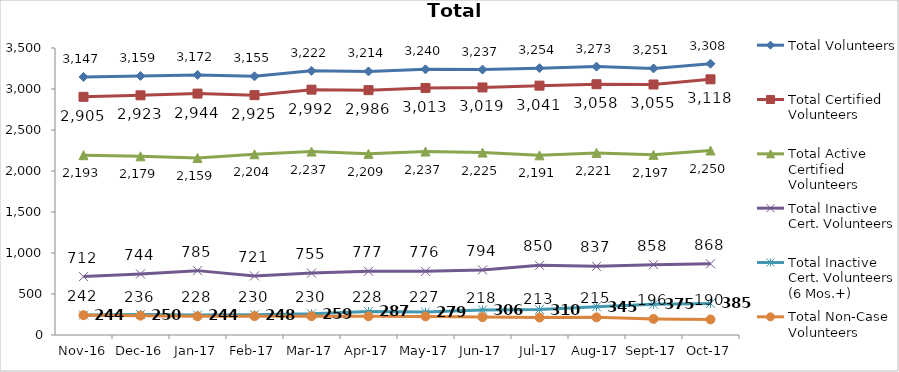
| Category | Total Volunteers | Total Certified Volunteers | Total Active Certified Volunteers | Total Inactive Cert. Volunteers | Total Inactive Cert. Volunteers (6 Mos.+) | Total Non-Case Volunteers |
|---|---|---|---|---|---|---|
| 2016-11-01 | 3147 | 2905 | 2193 | 712 | 244 | 242 |
| 2016-12-01 | 3159 | 2923 | 2179 | 744 | 250 | 236 |
| 2017-01-01 | 3172 | 2944 | 2159 | 785 | 244 | 228 |
| 2017-02-01 | 3155 | 2925 | 2204 | 721 | 248 | 230 |
| 2017-03-01 | 3222 | 2992 | 2237 | 755 | 259 | 230 |
| 2017-04-01 | 3214 | 2986 | 2209 | 777 | 287 | 228 |
| 2017-05-01 | 3240 | 3013 | 2237 | 776 | 279 | 227 |
| 2017-06-01 | 3237 | 3019 | 2225 | 794 | 306 | 218 |
| 2017-07-01 | 3254 | 3041 | 2191 | 850 | 310 | 213 |
| 2017-08-01 | 3273 | 3058 | 2221 | 837 | 345 | 215 |
| 2017-09-01 | 3251 | 3055 | 2197 | 858 | 375 | 196 |
| 2017-10-01 | 3308 | 3118 | 2250 | 868 | 385 | 190 |